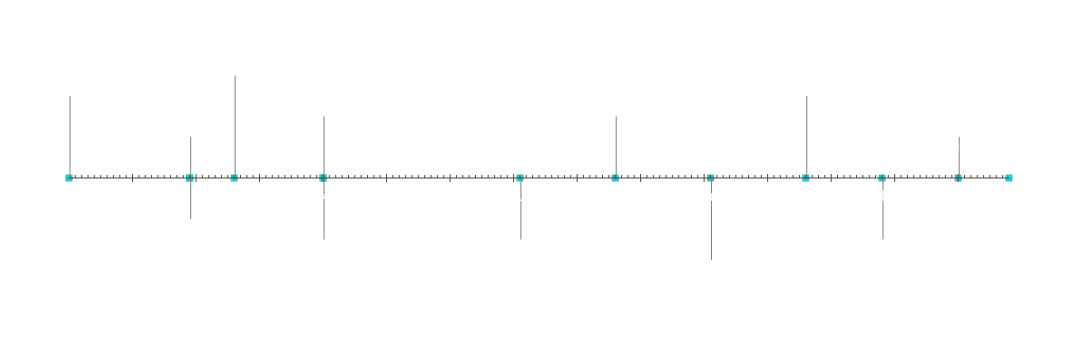
| Category | Cargo |
|---|---|
| Início do Projeto | 20 |
| Marco 1 | 10 |
| Marco 2 | -10 |
| Marco 3 | 25 |
| Marco 4 | -15 |
| Marco 5 | 15 |
| Marco 6 | -15 |
| Marco 7 | 15 |
| Marco 8 | -20 |
| Marco 9 | 20 |
| Marco 10 | -15 |
| Marco 11 | 10 |
| Fim do Projeto | 5 |